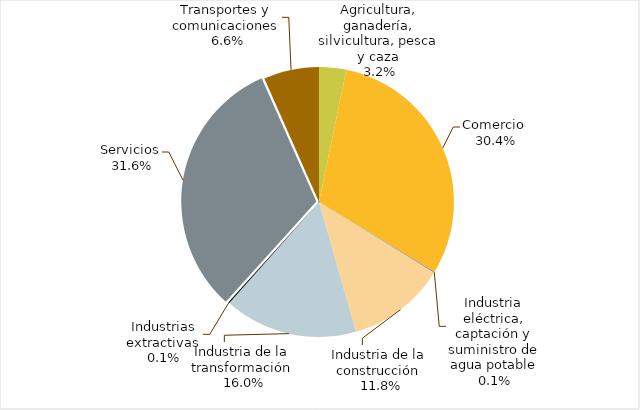
| Category | Series 0 |
|---|---|
| Agricultura, ganadería, silvicultura, pesca y caza | 0.032 |
| Comercio | 0.304 |
| Industria eléctrica, captación y suministro de agua potable | 0.001 |
| Industria de la construcción | 0.118 |
| Industria de la transformación | 0.16 |
| Industrias extractivas | 0.001 |
| Servicios | 0.317 |
| Transportes y comunicaciones | 0.066 |